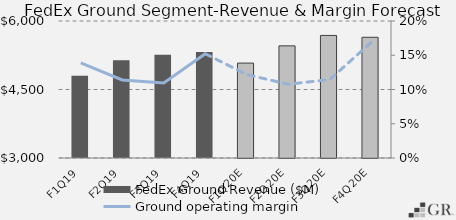
| Category | FedEx Ground Revenue ($M) |
|---|---|
|  F1Q19  | 4798.91 |
|  F2Q19  | 5141.812 |
|  F3Q19  | 5260.927 |
|  F4Q19  | 5319.645 |
|  F1Q20E  | 5078.533 |
|  F2Q20E  | 5455.389 |
|  F3Q20E  | 5683.551 |
|  F4Q20E  | 5643.26 |